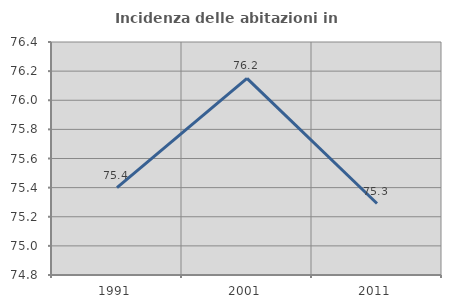
| Category | Incidenza delle abitazioni in proprietà  |
|---|---|
| 1991.0 | 75.4 |
| 2001.0 | 76.15 |
| 2011.0 | 75.291 |